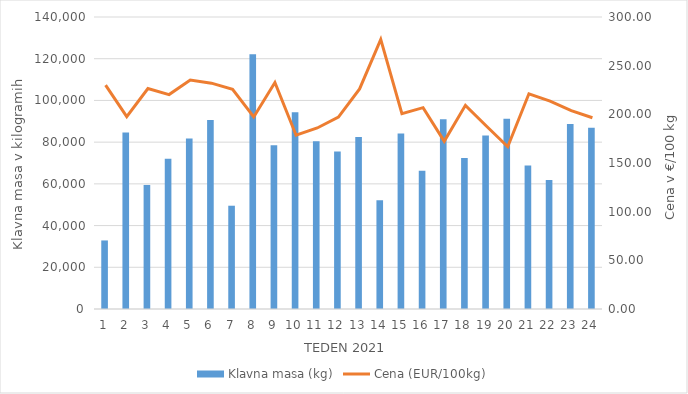
| Category | Klavna masa (kg) |
|---|---|
| 1.0 | 32871 |
| 2.0 | 84639 |
| 3.0 | 59476 |
| 4.0 | 72013 |
| 5.0 | 81759 |
| 6.0 | 90669 |
| 7.0 | 49517 |
| 8.0 | 122111 |
| 9.0 | 78545 |
| 10.0 | 94384 |
| 11.0 | 80405 |
| 12.0 | 75534 |
| 13.0 | 82440 |
| 14.0 | 52143 |
| 15.0 | 84105 |
| 16.0 | 66298 |
| 17.0 | 90925 |
| 18.0 | 72394 |
| 19.0 | 83193 |
| 20.0 | 91231 |
| 21.0 | 68763 |
| 22.0 | 61837 |
| 23.0 | 88747 |
| 24.0 | 86888 |